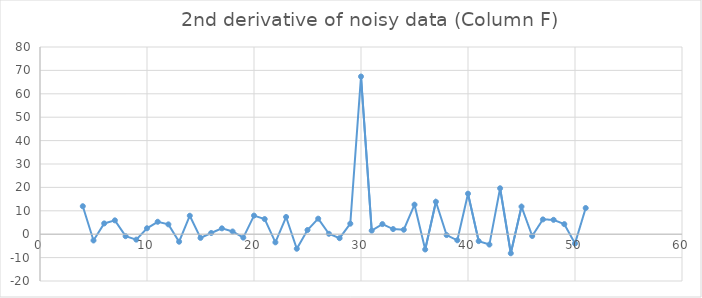
| Category | Series 0 |
|---|---|
| 4.0 | 11.961 |
| 5.0 | -2.674 |
| 6.0 | 4.601 |
| 7.0 | 5.913 |
| 8.0 | -0.844 |
| 9.0 | -2.322 |
| 10.0 | 2.534 |
| 11.0 | 5.308 |
| 12.0 | 4.202 |
| 13.0 | -3.214 |
| 14.0 | 7.89 |
| 15.0 | -1.579 |
| 16.0 | 0.524 |
| 17.0 | 2.496 |
| 18.0 | 1.153 |
| 19.0 | -1.457 |
| 20.0 | 7.941 |
| 21.0 | 6.472 |
| 22.0 | -3.48 |
| 23.0 | 7.356 |
| 24.0 | -6.214 |
| 25.0 | 1.787 |
| 26.0 | 6.638 |
| 27.0 | 0.178 |
| 28.0 | -1.7 |
| 29.0 | 4.5 |
| 30.0 | 67.382 |
| 31.0 | 1.522 |
| 32.0 | 4.316 |
| 33.0 | 2.189 |
| 34.0 | 1.916 |
| 35.0 | 12.618 |
| 36.0 | -6.528 |
| 37.0 | 13.853 |
| 38.0 | -0.364 |
| 39.0 | -2.596 |
| 40.0 | 17.316 |
| 41.0 | -2.958 |
| 42.0 | -4.431 |
| 43.0 | 19.625 |
| 44.0 | -8.152 |
| 45.0 | 11.796 |
| 46.0 | -0.76 |
| 47.0 | 6.319 |
| 48.0 | 6.141 |
| 49.0 | 4.296 |
| 50.0 | -3.972 |
| 51.0 | 11.181 |